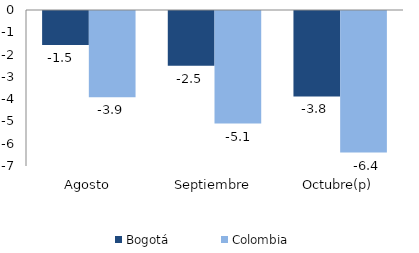
| Category | Bogotá | Colombia |
|---|---|---|
| Agosto | -1.522 | -3.875 |
| Septiembre | -2.459 | -5.052 |
| Octubre(p) | -3.834 | -6.351 |